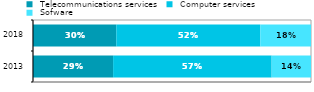
| Category |  Telecommunications services |  Computer services |  Sofware |
|---|---|---|---|
|  2013 | 0.288 | 0.57 | 0.142 |
| 2018 | 0.3 | 0.518 | 0.183 |